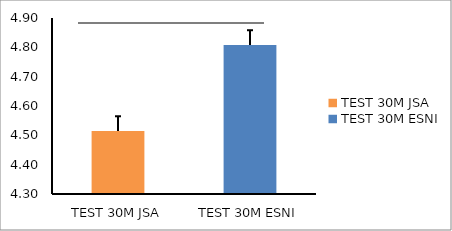
| Category | Series 0 |
|---|---|
| TEST 30M JSA | 4.515 |
| TEST 30M ESNI | 4.808 |